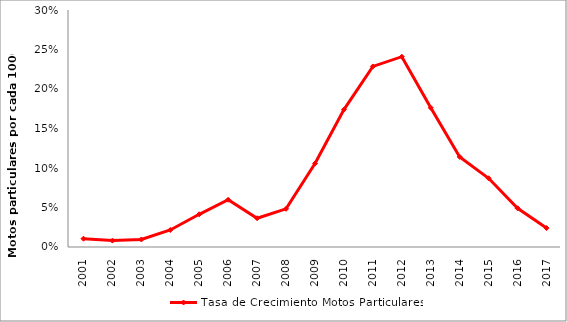
| Category | Tasa de Crecimiento Motos Particulares |
|---|---|
| 2001.0 | 0.011 |
| 2002.0 | 0.008 |
| 2003.0 | 0.01 |
| 2004.0 | 0.022 |
| 2005.0 | 0.041 |
| 2006.0 | 0.06 |
| 2007.0 | 0.036 |
| 2008.0 | 0.048 |
| 2009.0 | 0.106 |
| 2010.0 | 0.174 |
| 2011.0 | 0.229 |
| 2012.0 | 0.241 |
| 2013.0 | 0.176 |
| 2014.0 | 0.114 |
| 2015.0 | 0.087 |
| 2016.0 | 0.049 |
| 2017.0 | 0.024 |